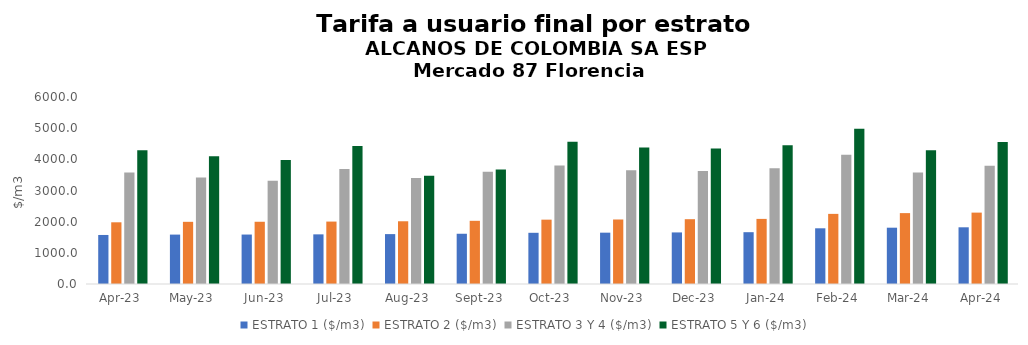
| Category | ESTRATO 1 ($/m3) | ESTRATO 2 ($/m3) | ESTRATO 3 Y 4 ($/m3) | ESTRATO 5 Y 6 ($/m3) |
|---|---|---|---|---|
| 2023-04-01 | 1573.28 | 1979.65 | 3575.22 | 4290.264 |
| 2023-05-01 | 1585.35 | 1995.07 | 3416.65 | 4099.98 |
| 2023-06-01 | 1586.86 | 1997.09 | 3316.57 | 3979.884 |
| 2023-07-01 | 1592.9 | 2003.01 | 3689.81 | 4427.772 |
| 2023-08-01 | 1600.9 | 2012.86 | 3401.48 | 3469.51 |
| 2023-09-01 | 1612.14 | 2027.25 | 3603.59 | 3675.662 |
| 2023-10-01 | 1642.77 | 2064.53 | 3805.44 | 4566.528 |
| 2023-11-01 | 1647.01 | 2069.85 | 3648.51 | 4378.212 |
| 2023-12-01 | 1654.75 | 2079.33 | 3624.28 | 4349.136 |
| 2024-01-01 | 1662.37 | 2089.02 | 3712.73 | 4455.276 |
| 2024-02-01 | 1787.28 | 2249.96 | 4149.96 | 4979.952 |
| 2024-03-01 | 1806.57 | 2274.53 | 3575.59 | 4290.708 |
| 2024-04-01 | 1819.34 | 2290.47 | 3795.47 | 4554.564 |